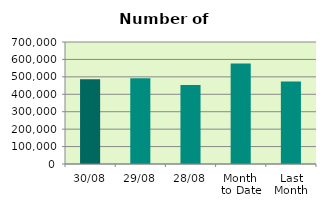
| Category | Series 0 |
|---|---|
| 30/08 | 486200 |
| 29/08 | 491570 |
| 28/08 | 453054 |
| Month 
to Date | 576518.909 |
| Last
Month | 472929.565 |